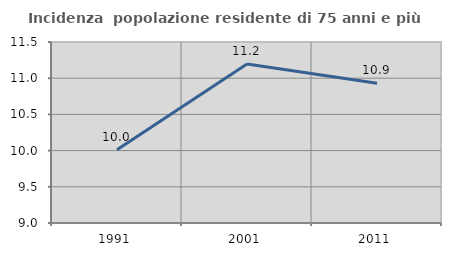
| Category | Incidenza  popolazione residente di 75 anni e più |
|---|---|
| 1991.0 | 10.013 |
| 2001.0 | 11.196 |
| 2011.0 | 10.929 |